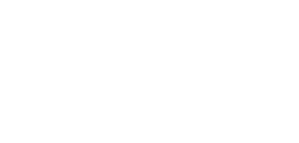
| Category | BAŞ. |
|---|---|
|  | 0 |
|  | 0 |